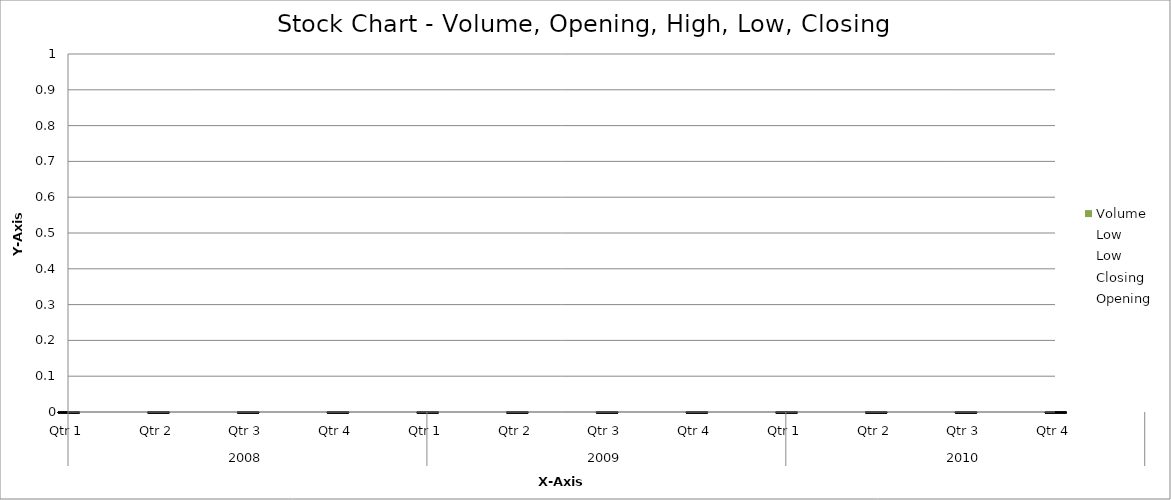
| Category | Volume |
|---|---|
| 0 | 139 |
| 1 | 124 |
| 2 | 148 |
| 3 | 127 |
| 4 | 135 |
| 5 | 129 |
| 6 | 135 |
| 7 | 147 |
| 8 | 120 |
| 9 | 146 |
| 10 | 120 |
| 11 | 150 |